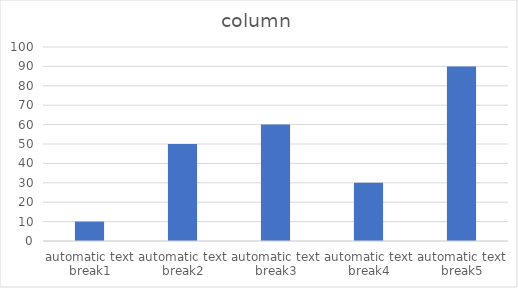
| Category | column |
|---|---|
| automatic text break1 | 10 |
| automatic text break2 | 50 |
| automatic text break3 | 60 |
| automatic text break4 | 30 |
| automatic text break5 | 90 |